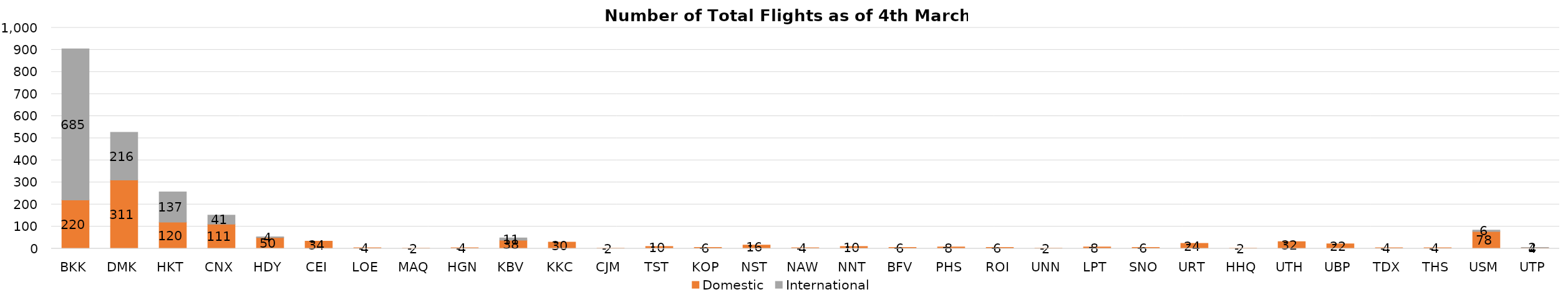
| Category | Domestic | International |
|---|---|---|
| BKK | 220 | 685 |
| DMK | 311 | 216 |
| HKT | 120 | 137 |
| CNX | 111 | 41 |
| HDY | 50 | 4 |
| CEI | 34 | 0 |
| LOE | 4 | 0 |
| MAQ | 2 | 0 |
| HGN | 4 | 0 |
| KBV | 38 | 11 |
| KKC | 30 | 0 |
| CJM | 2 | 0 |
| TST | 10 | 0 |
| KOP | 6 | 0 |
| NST | 16 | 0 |
| NAW | 4 | 0 |
| NNT | 10 | 0 |
| BFV | 6 | 0 |
| PHS | 8 | 0 |
| ROI | 6 | 0 |
| UNN | 2 | 0 |
| LPT | 8 | 0 |
| SNO | 6 | 0 |
| URT | 24 | 0 |
| HHQ | 2 | 0 |
| UTH | 32 | 0 |
| UBP | 22 | 0 |
| TDX | 4 | 0 |
| THS | 4 | 0 |
| USM | 78 | 6 |
| UTP | 4 | 2 |